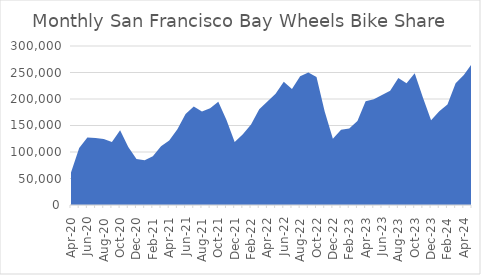
| Category | San Francisco |
|---|---|
| 2020-04-01 | 61491 |
| 2020-05-01 | 107752 |
| 2020-06-01 | 127410 |
| 2020-07-01 | 126504 |
| 2020-08-01 | 124440 |
| 2020-09-01 | 118813 |
| 2020-10-01 | 140922 |
| 2020-11-01 | 109369 |
| 2020-12-01 | 86947 |
| 2021-01-01 | 84220 |
| 2021-02-01 | 92094 |
| 2021-03-01 | 110803 |
| 2021-04-01 | 121504 |
| 2021-05-01 | 143118 |
| 2021-06-01 | 171670 |
| 2021-07-01 | 185965 |
| 2021-08-01 | 176560 |
| 2021-09-01 | 182636 |
| 2021-10-01 | 194648 |
| 2021-11-01 | 160462 |
| 2021-12-01 | 118635 |
| 2022-01-01 | 133552 |
| 2022-02-01 | 151680 |
| 2022-03-01 | 180821 |
| 2022-04-01 | 195197 |
| 2022-05-01 | 210115 |
| 2022-06-01 | 232779 |
| 2022-07-01 | 219083 |
| 2022-08-01 | 242739 |
| 2022-09-01 | 249838 |
| 2022-10-01 | 241554 |
| 2022-11-01 | 176328 |
| 2022-12-01 | 125090 |
| 2023-01-01 | 141860 |
| 2023-02-01 | 144166 |
| 2023-03-01 | 158330 |
| 2023-04-01 | 195724 |
| 2023-05-01 | 199483 |
| 2023-06-01 | 207622 |
| 2023-07-01 | 215339 |
| 2023-08-01 | 239716 |
| 2023-09-01 | 229900 |
| 2023-10-01 | 248641 |
| 2023-11-01 | 202694 |
| 2023-12-01 | 159870 |
| 2024-01-01 | 176751 |
| 2024-02-01 | 189821 |
| 2024-03-01 | 229895 |
| 2024-04-01 | 245472 |
| 2024-05-01 | 266981 |